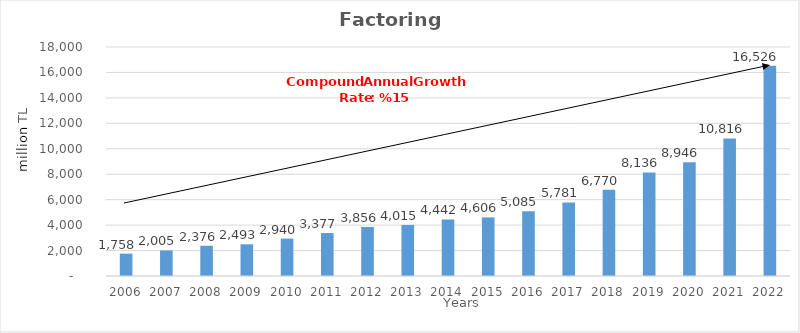
| Category | Factoring |
|---|---|
| 2006.0 | 1757.796 |
| 2007.0 | 2005.232 |
| 2008.0 | 2375.996 |
| 2009.0 | 2493.335 |
| 2010.0 | 2940.32 |
| 2011.0 | 3376.552 |
| 2012.0 | 3855.882 |
| 2013.0 | 4014.568 |
| 2014.0 | 4442 |
| 2015.0 | 4606 |
| 2016.0 | 5085 |
| 2017.0 | 5781 |
| 2018.0 | 6770 |
| 2019.0 | 8136 |
| 2020.0 | 8946 |
| 2021.0 | 10816 |
| 2022.0 | 16526 |